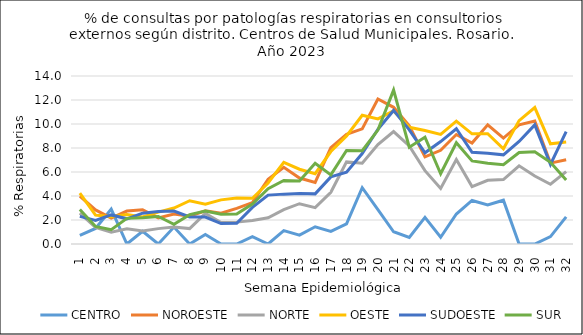
| Category | CENTRO | NOROESTE | NORTE | OESTE | SUDOESTE | SUR |
|---|---|---|---|---|---|---|
| 1.0 | 0.714 | 3.983 | 2.566 | 4.246 | 2.303 | 2.88 |
| 2.0 | 1.299 | 2.837 | 1.376 | 2.416 | 1.965 | 1.466 |
| 3.0 | 2.913 | 2.163 | 0.98 | 2.268 | 2.423 | 1.189 |
| 4.0 | 0 | 2.744 | 1.259 | 2.463 | 2.098 | 2.136 |
| 5.0 | 1.064 | 2.86 | 1.089 | 2.257 | 2.57 | 2.179 |
| 6.0 | 0 | 2.178 | 1.282 | 2.656 | 2.711 | 2.291 |
| 7.0 | 1.408 | 2.5 | 1.413 | 2.998 | 2.747 | 1.647 |
| 8.0 | 0 | 2.322 | 1.282 | 3.604 | 2.249 | 2.45 |
| 9.0 | 0.794 | 2.77 | 2.551 | 3.314 | 2.24 | 2.743 |
| 10.0 | 0 | 2.561 | 1.788 | 3.677 | 1.707 | 2.474 |
| 11.0 | 0 | 2.973 | 1.823 | 3.831 | 1.734 | 2.493 |
| 12.0 | 0.613 | 3.45 | 1.961 | 3.811 | 3.056 | 3.337 |
| 13.0 | 0 | 5.396 | 2.183 | 5.086 | 4.075 | 4.61 |
| 14.0 | 1.111 | 6.397 | 2.862 | 6.796 | 4.156 | 5.289 |
| 15.0 | 0.741 | 5.499 | 3.359 | 6.23 | 4.208 | 5.254 |
| 16.0 | 1.435 | 5.127 | 3.035 | 5.858 | 4.178 | 6.73 |
| 17.0 | 1.047 | 8.03 | 4.309 | 7.707 | 5.59 | 5.762 |
| 18.0 | 1.681 | 9.147 | 6.842 | 9.006 | 5.976 | 7.797 |
| 19.0 | 4.688 | 9.597 | 6.735 | 10.729 | 7.54 | 7.777 |
| 20.0 | 2.857 | 12.083 | 8.287 | 10.421 | 9.56 | 9.49 |
| 21.0 | 1.02 | 11.391 | 9.372 | 11.094 | 11.131 | 12.824 |
| 22.0 | 0.543 | 9.843 | 8.166 | 9.721 | 9.512 | 8.062 |
| 23.0 | 2.222 | 7.256 | 6.111 | 9.451 | 7.6 | 8.902 |
| 24.0 | 0.565 | 7.805 | 4.625 | 9.132 | 8.537 | 5.857 |
| 25.0 | 2.5 | 9.122 | 7.046 | 10.241 | 9.607 | 8.434 |
| 26.0 | 3.627 | 8.413 | 4.789 | 9.179 | 7.648 | 6.919 |
| 27.0 | 3.252 | 9.933 | 5.311 | 9.185 | 7.56 | 6.723 |
| 28.0 | 3.65 | 8.825 | 5.369 | 7.937 | 7.431 | 6.61 |
| 29.0 | 0 | 9.934 | 6.519 | 10.281 | 8.547 | 7.621 |
| 30.0 | 0 | 10.253 | 5.67 | 11.372 | 9.928 | 7.686 |
| 31.0 | 0.617 | 6.741 | 4.976 | 8.351 | 6.632 | 6.809 |
| 32.0 | 2.256 | 7.025 | 6.034 | 8.494 | 9.366 | 5.335 |